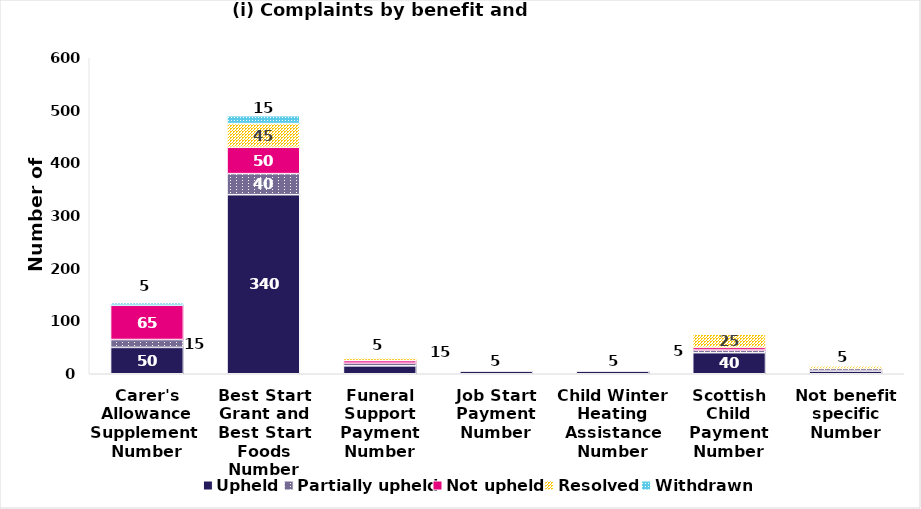
| Category | Upheld | Partially upheld | Not upheld | Resolved | Withdrawn |
|---|---|---|---|---|---|
| Carer's Allowance Supplement 
Number | 50 | 15 | 65 | 0 | 5 |
| Best Start Grant and Best Start Foods
Number | 340 | 40 | 50 | 45 | 15 |
| Funeral Support Payment
Number | 15 | 5 | 5 | 5 | 0 |
| Job Start Payment
Number | 5 | 0 | 0 | 0 | 0 |
| Child Winter Heating Assistance
Number | 5 | 0 | 0 | 0 | 0 |
| Scottish Child Payment
Number | 40 | 5 | 5 | 25 | 0 |
| Not benefit specific
Number | 5 | 5 | 0 | 5 | 0 |